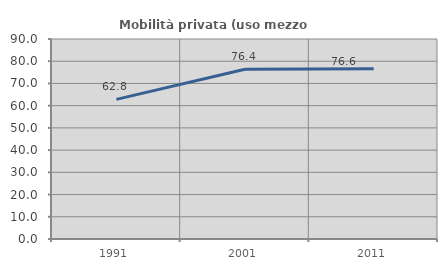
| Category | Mobilità privata (uso mezzo privato) |
|---|---|
| 1991.0 | 62.842 |
| 2001.0 | 76.392 |
| 2011.0 | 76.584 |